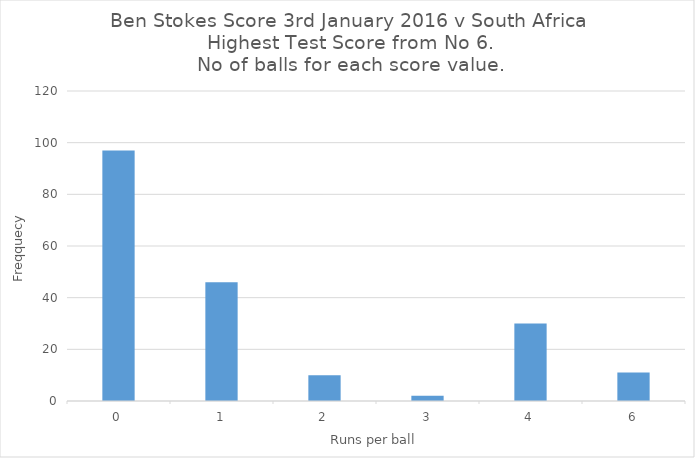
| Category | Balls |
|---|---|
| 0.0 | 97 |
| 1.0 | 46 |
| 2.0 | 10 |
| 3.0 | 2 |
| 4.0 | 30 |
| 6.0 | 11 |